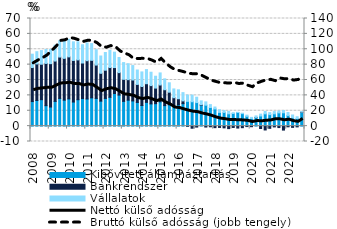
| Category | Kibővített államháztartás | Bankrendszer | Vállalatok |
|---|---|---|---|
| 2008.0 | 15.98 | 22.129 | 8.686 |
| 2008.0 | 16.672 | 23.786 | 7.961 |
| 2008.0 | 17.205 | 23.055 | 8.864 |
| 2008.0 | 13.305 | 27.479 | 9.001 |
| 2009.0 | 12.421 | 28.214 | 9.185 |
| 2009.0 | 16.073 | 26.257 | 10.297 |
| 2009.0 | 18.018 | 26.908 | 10.607 |
| 2009.0 | 16.892 | 27.199 | 11.642 |
| 2010.0 | 17.709 | 27.323 | 11.434 |
| 2010.0 | 15.677 | 27.05 | 12.099 |
| 2010.0 | 17.174 | 25.913 | 11.79 |
| 2010.0 | 17.938 | 23.117 | 11.88 |
| 2011.0 | 17.66 | 24.887 | 11.548 |
| 2011.0 | 18.395 | 24.412 | 10.845 |
| 2011.0 | 18.018 | 21.689 | 10.013 |
| 2011.0 | 16.258 | 18.104 | 11.245 |
| 2012.0 | 18.001 | 18.362 | 11.53 |
| 2012.0 | 18.758 | 19.341 | 11.252 |
| 2012.0 | 21.196 | 16.894 | 10.013 |
| 2012.0 | 20.171 | 14.629 | 9.826 |
| 2013.0 | 16.11 | 14.328 | 10.887 |
| 2013.0 | 16.882 | 13.34 | 10.367 |
| 2013.0 | 16.389 | 13.602 | 9.401 |
| 2013.0 | 15.4 | 11.723 | 9.37 |
| 2014.0 | 13.401 | 12.351 | 9.502 |
| 2014.0 | 15.448 | 12.137 | 9.187 |
| 2014.0 | 14.465 | 11.891 | 8.697 |
| 2014.0 | 14.601 | 10.149 | 7.703 |
| 2015.0 | 15.845 | 10.906 | 7.86 |
| 2015.0 | 13.34 | 10.329 | 7.084 |
| 2015.0 | 13.85 | 8.225 | 6.106 |
| 2015.0 | 12.857 | 5.629 | 5.704 |
| 2016.0 | 13.888 | 3.932 | 5.793 |
| 2016.0 | 14.612 | 1.8 | 5.376 |
| 2016.0 | 16.116 | -0.068 | 4.089 |
| 2016.0 | 15.868 | -1.368 | 4.316 |
| 2017.0 | 15.314 | -0.624 | 3.491 |
| 2017.0 | 13.558 | 0.346 | 2.536 |
| 2017.0 | 13.622 | -0.599 | 2.153 |
| 2017.0 | 12.115 | -0.426 | 1.875 |
| 2018.0 | 11.193 | -0.991 | 1.242 |
| 2018.0 | 8.939 | -0.842 | 1.709 |
| 2018.0 | 8.903 | -1.124 | 1.228 |
| 2018.0 | 8.007 | -1.622 | 1.552 |
| 2019.0 | 8.231 | -0.872 | 0.514 |
| 2019.0 | 8.893 | -1.257 | 0.04 |
| 2019.0 | 8.132 | -1.015 | 0.269 |
| 2019.0 | 6.395 | -0.294 | 0.746 |
| 2020.0 | 5 | -0.371 | 0.688 |
| 2020.0 | 5.539 | 0.137 | 0.971 |
| 2020.0 | 6.595 | -1.564 | 1.212 |
| 2020.0 | 7.996 | -2.495 | 1.529 |
| 2021.0 | 7.472 | -1.442 | 1.326 |
| 2021.0 | 8.004 | -0.52 | 1.429 |
| 2021.0 | 8.615 | -0.942 | 1.197 |
| 2021.0 | 8.674 | -2.575 | 1.467 |
| 2022.0 | 6.948 | -0.447 | 1.942 |
| 2022.0 | 5.372 | -0.815 | 1.872 |
| 2022.0 | 4.903 | -0.491 | 1.186 |
| 2022.0 | 8.855 | 0.246 | 0.324 |